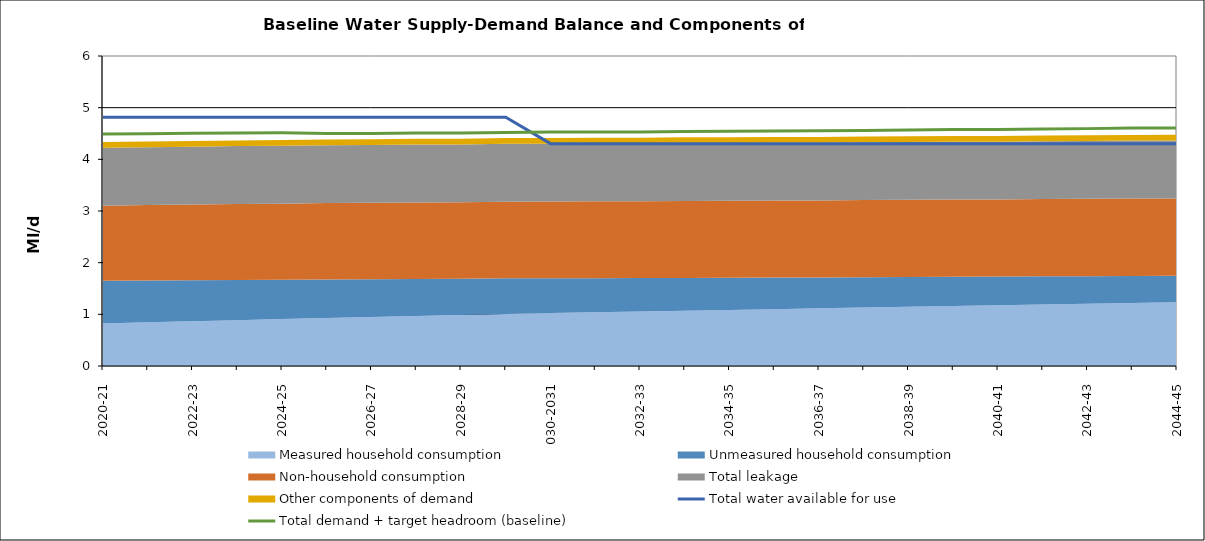
| Category | Total water available for use | Total demand + target headroom (baseline) |
|---|---|---|
| 0 | 4.814 | 4.49 |
| 1 | 4.814 | 4.494 |
| 2 | 4.814 | 4.503 |
| 3 | 4.814 | 4.508 |
| 4 | 4.814 | 4.512 |
| 5 | 4.814 | 4.499 |
| 6 | 4.814 | 4.5 |
| 7 | 4.814 | 4.511 |
| 8 | 4.814 | 4.51 |
| 9 | 4.814 | 4.521 |
| 10 | 4.304 | 4.527 |
| 11 | 4.304 | 4.53 |
| 12 | 4.304 | 4.529 |
| 13 | 4.304 | 4.538 |
| 14 | 4.304 | 4.543 |
| 15 | 4.304 | 4.549 |
| 16 | 4.304 | 4.552 |
| 17 | 4.304 | 4.56 |
| 18 | 4.304 | 4.569 |
| 19 | 4.304 | 4.577 |
| 20 | 4.304 | 4.577 |
| 21 | 4.304 | 4.587 |
| 22 | 4.304 | 4.594 |
| 23 | 4.304 | 4.606 |
| 24 | 4.304 | 4.608 |